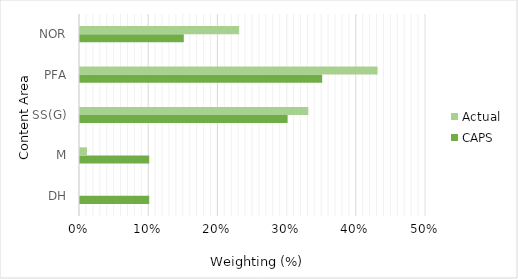
| Category | CAPS | Actual |
|---|---|---|
| DH | 0.1 | 0 |
| M | 0.1 | 0.01 |
| SS(G) | 0.3 | 0.33 |
| PFA | 0.35 | 0.43 |
| NOR | 0.15 | 0.23 |